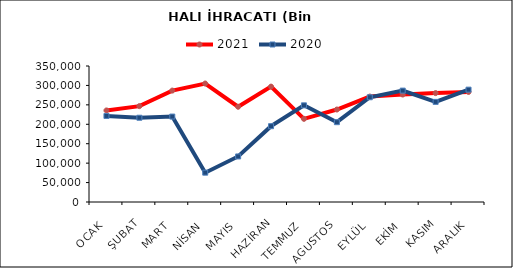
| Category | 2021 | 2020 |
|---|---|---|
| OCAK | 235590.768 | 221439.794 |
| ŞUBAT | 246727.255 | 216850.7 |
| MART | 286759.179 | 219868.656 |
| NİSAN | 304914.442 | 75483.475 |
| MAYIS | 245146.346 | 117221.57 |
| HAZİRAN | 296918.054 | 195131.128 |
| TEMMUZ | 214045.725 | 248773.955 |
| AGUSTOS | 237977.142 | 205412.211 |
| EYLÜL | 271361.996 | 269573.724 |
| EKİM | 276617.133 | 286633.869 |
| KASIM | 280209.286 | 257658.163 |
| ARALIK | 283216.104 | 289157.744 |